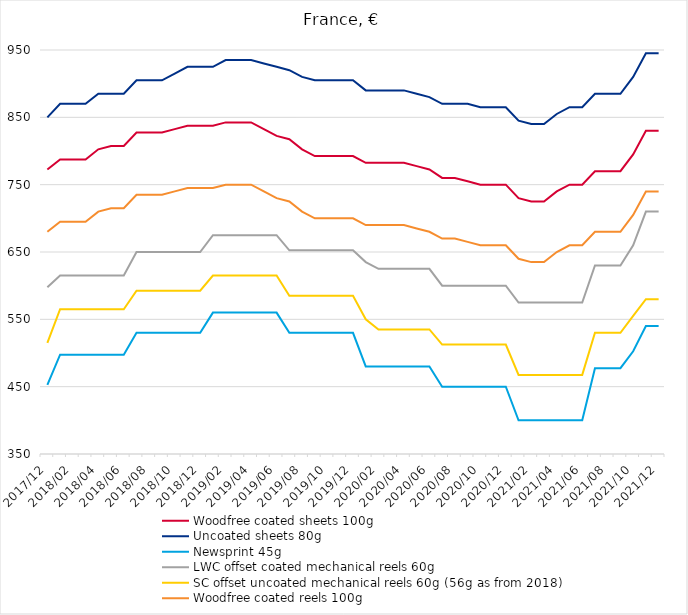
| Category | Woodfree coated sheets 100g | Uncoated sheets 80g | Newsprint 45g | LWC offset coated mechanical reels 60g | SC offset uncoated mechanical reels 60g (56g as from 2018) | Woodfree coated reels 100g |
|---|---|---|---|---|---|---|
| 2017/12 | 772.5 | 850 | 452.5 | 597.5 | 515 | 680 |
| 2018/01 | 787.5 | 870 | 497.5 | 615 | 565 | 695 |
| 2018/02 | 787.5 | 870 | 497.5 | 615 | 565 | 695 |
| 2018/03 | 787.5 | 870 | 497.5 | 615 | 565 | 695 |
| 2018/04 | 802.5 | 885 | 497.5 | 615 | 565 | 710 |
| 2018/05 | 807.5 | 885 | 497.5 | 615 | 565 | 715 |
| 2018/06 | 807.5 | 885 | 497.5 | 615 | 565 | 715 |
| 2018/07 | 827.5 | 905 | 530 | 650 | 592.5 | 735 |
| 2018/08 | 827.5 | 905 | 530 | 650 | 592.5 | 735 |
| 2018/09 | 827.5 | 905 | 530 | 650 | 592.5 | 735 |
| 2018/10 | 832.5 | 915 | 530 | 650 | 592.5 | 740 |
| 2018/11 | 837.5 | 925 | 530 | 650 | 592.5 | 745 |
| 2018/12 | 837.5 | 925 | 530 | 650 | 592.5 | 745 |
| 2019/01 | 837.5 | 925 | 560 | 675 | 615 | 745 |
| 2019/02 | 842.5 | 935 | 560 | 675 | 615 | 750 |
| 2019/03 | 842.5 | 935 | 560 | 675 | 615 | 750 |
| 2019/04 | 842.5 | 935 | 560 | 675 | 615 | 750 |
| 2019/05 | 832.5 | 930 | 560 | 675 | 615 | 740 |
| 2019/06 | 822.5 | 925 | 560 | 675 | 615 | 730 |
| 2019/07 | 817.5 | 920 | 530 | 652.5 | 585 | 725 |
| 2019/08 | 802.5 | 910 | 530 | 652.5 | 585 | 710 |
| 2019/09 | 792.5 | 905 | 530 | 652.5 | 585 | 700 |
| 2019/10 | 792.5 | 905 | 530 | 652.5 | 585 | 700 |
| 2019/11 | 792.5 | 905 | 530 | 652.5 | 585 | 700 |
| 2019/12 | 792.5 | 905 | 530 | 652.5 | 585 | 700 |
| 2020/01 | 782.5 | 890 | 480 | 635 | 550 | 690 |
| 2020/02 | 782.5 | 890 | 480 | 625 | 535 | 690 |
| 2020/03 | 782.5 | 890 | 480 | 625 | 535 | 690 |
| 2020/04 | 782.5 | 890 | 480 | 625 | 535 | 690 |
| 2020/05 | 777.5 | 885 | 480 | 625 | 535 | 685 |
| 2020/06 | 772.5 | 880 | 480 | 625 | 535 | 680 |
| 2020/07 | 760 | 870 | 450 | 600 | 512.5 | 670 |
| 2020/08 | 760 | 870 | 450 | 600 | 512.5 | 670 |
| 2020/09 | 755 | 870 | 450 | 600 | 512.5 | 665 |
| 2020/10 | 750 | 865 | 450 | 600 | 512.5 | 660 |
| 2020/11 | 750 | 865 | 450 | 600 | 512.5 | 660 |
| 2020/12 | 750 | 865 | 450 | 600 | 512.5 | 660 |
| 2021/01 | 730 | 845 | 400 | 575 | 467.5 | 640 |
| 2021/02 | 725 | 840 | 400 | 575 | 467.5 | 635 |
| 2021/03 | 725 | 840 | 400 | 575 | 467.5 | 635 |
| 2021/04 | 740 | 855 | 400 | 575 | 467.5 | 650 |
| 2021/05 | 750 | 865 | 400 | 575 | 467.5 | 660 |
| 2021/06 | 750 | 865 | 400 | 575 | 467.5 | 660 |
| 2021/07 | 770 | 885 | 477.5 | 630 | 530 | 680 |
| 2021/08 | 770 | 885 | 477.5 | 630 | 530 | 680 |
| 2021/09 | 770 | 885 | 477.5 | 630 | 530 | 680 |
| 2021/10 | 795 | 910 | 502.5 | 660 | 555 | 705 |
| 2021/11 | 830 | 945 | 540 | 710 | 580 | 740 |
| 2021/12 | 830 | 945 | 540 | 710 | 580 | 740 |